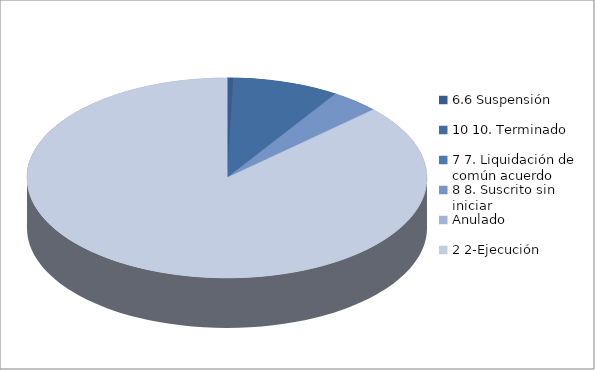
| Category | Series 0 |
|---|---|
| 6.6 Suspensión | 2 |
| 10 10. Terminado | 35 |
| 7 7. Liquidación de común acuerdo | 0 |
| 8 8. Suscrito sin iniciar | 16 |
| Anulado | 0 |
| 2 2-Ejecución | 353 |